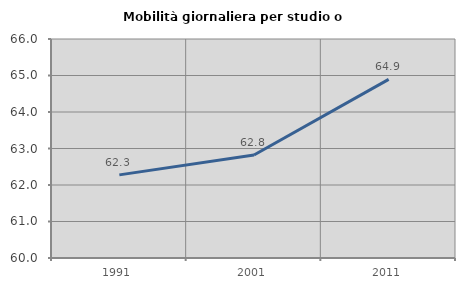
| Category | Mobilità giornaliera per studio o lavoro |
|---|---|
| 1991.0 | 62.277 |
| 2001.0 | 62.823 |
| 2011.0 | 64.894 |